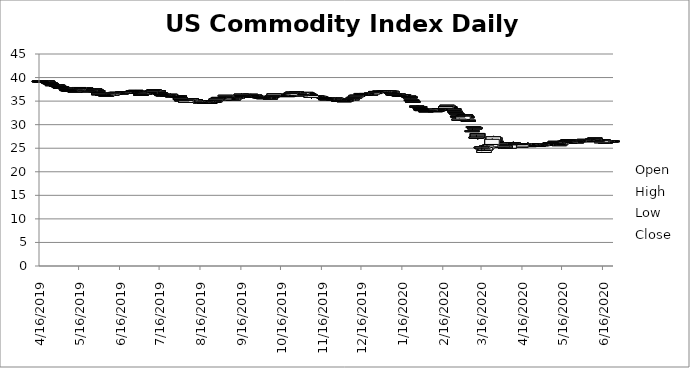
| Category | Open | High | Low | Close |
|---|---|---|---|---|
| 6/23/20 | 26.52 | 26.63 | 26.373 | 26.57 |
| 6/22/20 | 26.58 | 26.58 | 26.45 | 26.52 |
| 6/19/20 | 26.35 | 26.66 | 26.35 | 26.47 |
| 6/18/20 | 26.33 | 26.44 | 26.28 | 26.31 |
| 6/17/20 | 26.38 | 26.57 | 26.38 | 26.57 |
| 6/16/20 | 26.82 | 26.82 | 26.36 | 26.5 |
| 6/15/20 | 26.17 | 26.62 | 26.02 | 26.58 |
| 6/12/20 | 26.69 | 26.75 | 26.47 | 26.58 |
| 6/11/20 | 26.7 | 26.88 | 26.49 | 26.49 |
| 6/10/20 | 27.11 | 27.18 | 26.895 | 27.18 |
| 6/9/20 | 26.71 | 26.93 | 26.71 | 26.898 |
| 6/8/20 | 26.8 | 26.93 | 26.77 | 26.92 |
| 6/5/20 | 26.8 | 26.8 | 26.71 | 26.71 |
| 6/4/20 | 26.55 | 26.819 | 26.55 | 26.75 |
| 6/3/20 | 26.6 | 26.83 | 26.49 | 26.55 |
| 6/2/20 | 26.88 | 26.887 | 26.68 | 26.68 |
| 6/1/20 | 26.63 | 26.86 | 26.515 | 26.77 |
| 5/29/20 | 26.41 | 26.665 | 26.4 | 26.64 |
| 5/28/20 | 26.65 | 26.65 | 26.326 | 26.42 |
| 5/27/20 | 26.27 | 26.5 | 26.27 | 26.35 |
| 5/26/20 | 26.53 | 26.55 | 26.492 | 26.55 |
| 5/22/20 | 26.11 | 26.37 | 26.11 | 26.34 |
| 5/21/20 | 26.78 | 26.86 | 26.336 | 26.336 |
| 5/20/20 | 26.69 | 26.84 | 26.68 | 26.68 |
| 5/19/20 | 26.44 | 26.71 | 26.44 | 26.5 |
| 5/18/20 | 26.43 | 26.67 | 26.31 | 26.46 |
| 5/15/20 | 25.76 | 26.178 | 25.76 | 26.1 |
| 5/14/20 | 25.55 | 25.907 | 25.55 | 25.82 |
| 5/13/20 | 26.29 | 26.29 | 25.78 | 25.79 |
| 5/12/20 | 26.09 | 26.27 | 25.94 | 26.14 |
| 5/11/20 | 26.46 | 26.46 | 26 | 26.06 |
| 5/8/20 | 26.21 | 26.4 | 26.145 | 26.21 |
| 5/7/20 | 26.12 | 26.2 | 25.975 | 26.06 |
| 5/6/20 | 25.86 | 25.89 | 25.72 | 25.89 |
| 5/5/20 | 25.81 | 25.95 | 25.758 | 25.77 |
| 5/4/20 | 25.61 | 25.87 | 25.61 | 25.79 |
| 5/1/20 | 25.55 | 25.9 | 25.55 | 25.81 |
| 4/30/20 | 25.66 | 25.81 | 25.56 | 25.77 |
| 4/29/20 | 25.84 | 25.87 | 25.555 | 25.6 |
| 4/28/20 | 25.58 | 25.816 | 25.515 | 25.64 |
| 4/27/20 | 25.58 | 25.62 | 25.45 | 25.5 |
| 4/24/20 | 25.98 | 25.98 | 25.45 | 25.54 |
| 4/23/20 | 26 | 26 | 25.72 | 25.92 |
| 4/22/20 | 25.66 | 25.91 | 25.66 | 25.85 |
| 4/21/20 | 25.56 | 25.7 | 25.35 | 25.51 |
| 4/20/20 | 26 | 26.25 | 25.95 | 25.99 |
| 4/17/20 | 25.77 | 26.079 | 25.77 | 25.99 |
| 4/16/20 | 25.89 | 26 | 25.78 | 25.98 |
| 4/15/20 | 25.27 | 25.89 | 25.27 | 25.77 |
| 4/14/20 | 25.97 | 26.23 | 25.782 | 25.95 |
| 4/13/20 | 25.98 | 26.1 | 25.739 | 25.92 |
| 4/9/20 | 26.05 | 26.4 | 25.99 | 26.12 |
| 4/8/20 | 26 | 26.268 | 26 | 26.1 |
| 4/7/20 | 25.9 | 26.05 | 25.755 | 25.88 |
| 4/6/20 | 25 | 25.7 | 25 | 25.7 |
| 4/3/20 | 25.58 | 25.58 | 25 | 25.06 |
| 4/2/20 | 25.69 | 25.69 | 25.14 | 25.57 |
| 4/1/20 | 25.28 | 25.87 | 25.28 | 25.53 |
| 3/31/20 | 25.97 | 26.07 | 25.72 | 25.9 |
| 3/30/20 | 25.87 | 26.08 | 25.73 | 26.08 |
| 3/27/20 | 26.5 | 26.5 | 26.151 | 26.352 |
| 3/26/20 | 27.23 | 27.25 | 26.501 | 26.79 |
| 3/25/20 | 26.7 | 27.62 | 26.7 | 27.43 |
| 3/24/20 | 25.8 | 27.13 | 25.8 | 26.895 |
| 3/23/20 | 25.29 | 25.84 | 25.29 | 25.79 |
| 3/20/20 | 24.84 | 25.868 | 24.84 | 25.5 |
| 3/19/20 | 24.61 | 25.344 | 24.559 | 25.15 |
| 3/18/20 | 24.1 | 25.154 | 24.03 | 24.52 |
| 3/17/20 | 24.87 | 25.795 | 24.87 | 25.314 |
| 3/16/20 | 25.12 | 25.64 | 24.37 | 25.24 |
| 3/13/20 | 28.13 | 28.13 | 26.865 | 27.23 |
| 3/12/20 | 27.19 | 27.846 | 27.19 | 27.36 |
| 3/11/20 | 29.39 | 29.465 | 29.055 | 29.095 |
| 3/10/20 | 29.42 | 29.66 | 29.293 | 29.59 |
| 3/9/20 | 28.56 | 29.202 | 28.49 | 28.73 |
| 3/6/20 | 30.95 | 31.2 | 30.62 | 30.72 |
| 3/5/20 | 31.67 | 31.72 | 31.429 | 31.47 |
| 3/4/20 | 32.06 | 32.067 | 31.82 | 31.866 |
| 3/3/20 | 31.92 | 32.323 | 31.84 | 32.01 |
| 3/2/20 | 31.11 | 31.84 | 31.11 | 31.8 |
| 2/28/20 | 31 | 31.31 | 30.91 | 31.18 |
| 2/27/20 | 31.83 | 31.98 | 31.64 | 31.79 |
| 2/26/20 | 32.47 | 32.6 | 32.31 | 32.31 |
| 2/25/20 | 32.87 | 33.09 | 32.63 | 32.639 |
| 2/24/20 | 33.37 | 33.57 | 33.061 | 33.09 |
| 2/21/20 | 33.78 | 33.87 | 33.712 | 33.75 |
| 2/20/20 | 33.94 | 34.08 | 33.87 | 33.93 |
| 2/19/20 | 33.9 | 34.133 | 33.86 | 34.115 |
| 2/18/20 | 33.5 | 33.86 | 33.5 | 33.85 |
| 2/14/20 | 33.28 | 33.4 | 33.28 | 33.31 |
| 2/13/20 | 33.28 | 33.35 | 33.28 | 33.33 |
| 2/12/20 | 33.14 | 33.2 | 33.06 | 33.17 |
| 2/11/20 | 33.08 | 33.085 | 32.96 | 32.98 |
| 2/10/20 | 32.97 | 33.01 | 32.895 | 32.91 |
| 2/7/20 | 33.18 | 33.25 | 33.17 | 33.19 |
| 2/6/20 | 32.96 | 33.3 | 32.96 | 33.3 |
| 2/5/20 | 33.06 | 33.16 | 33.04 | 33.07 |
| 2/4/20 | 33.07 | 33.12 | 32.89 | 32.92 |
| 2/3/20 | 32.93 | 33.017 | 32.76 | 32.9 |
| 1/31/20 | 33.2 | 33.3 | 33.061 | 33.08 |
| 1/30/20 | 33.37 | 33.424 | 33.2 | 33.375 |
| 1/29/20 | 33.84 | 33.84 | 33.549 | 33.583 |
| 1/28/20 | 33.83 | 34.02 | 33.79 | 33.86 |
| 1/27/20 | 33.95 | 34.05 | 33.76 | 33.82 |
| 1/24/20 | 34.98 | 34.98 | 34.68 | 34.75 |
| 1/23/20 | 35.23 | 35.34 | 35.1 | 35.305 |
| 1/22/20 | 35.88 | 35.88 | 35.63 | 35.67 |
| 1/21/20 | 36.06 | 36.07 | 35.94 | 35.95 |
| 1/17/20 | 36.22 | 36.34 | 36.15 | 36.34 |
| 1/16/20 | 36.29 | 36.326 | 36.05 | 36.11 |
| 1/15/20 | 36.4 | 36.4 | 36.195 | 36.34 |
| 1/14/20 | 36.12 | 36.28 | 36.1 | 36.28 |
| 1/13/20 | 36.5 | 36.5 | 36.15 | 36.17 |
| 1/10/20 | 36.43 | 36.58 | 36.37 | 36.45 |
| 1/9/20 | 36.54 | 36.54 | 36.321 | 36.37 |
| 1/8/20 | 37.07 | 37.07 | 36.43 | 36.65 |
| 1/7/20 | 36.83 | 37.097 | 36.83 | 37.064 |
| 1/6/20 | 37.12 | 37.12 | 36.86 | 36.88 |
| 1/3/20 | 36.96 | 37.27 | 36.96 | 37.07 |
| 1/2/20 | 36.9 | 37.15 | 36.9 | 37.1 |
| 12/31/19 | 37.02 | 37.04 | 36.83 | 36.9 |
| 12/30/19 | 36.97 | 37.25 | 36.97 | 37.12 |
| 12/27/19 | 37.05 | 37.092 | 37.03 | 37.05 |
| 12/26/19 | 36.7 | 36.95 | 36.7 | 36.82 |
| 12/24/19 | 36.43 | 36.781 | 36.43 | 36.781 |
| 12/23/19 | 36.28 | 36.516 | 36.28 | 36.49 |
| 12/20/19 | 36.62 | 36.641 | 36.5 | 36.517 |
| 12/19/19 | 36.45 | 36.531 | 36.45 | 36.49 |
| 12/18/19 | 36.38 | 36.54 | 36 | 36.45 |
| 12/17/19 | 36.54 | 36.54 | 36.46 | 36.47 |
| 12/16/19 | 36.43 | 36.65 | 36.411 | 36.62 |
| 12/13/19 | 36.23 | 36.59 | 36.111 | 36.16 |
| 12/12/19 | 35.92 | 36.23 | 35.57 | 36.22 |
| 12/11/19 | 35.73 | 35.94 | 35.64 | 35.86 |
| 12/10/19 | 35.55 | 35.82 | 35.55 | 35.78 |
| 12/9/19 | 35.32 | 35.585 | 35.32 | 35.48 |
| 12/6/19 | 35.3 | 35.52 | 35.3 | 35.46 |
| 12/5/19 | 35.09 | 35.378 | 35.09 | 35.3 |
| 12/4/19 | 35.27 | 35.356 | 35.19 | 35.19 |
| 12/3/19 | 34.95 | 35.185 | 34.942 | 35.08 |
| 12/2/19 | 35.13 | 35.13 | 34.93 | 34.98 |
| 11/29/19 | 35.17 | 35.2 | 35.02 | 35.02 |
| 11/27/19 | 35.58 | 35.62 | 35.41 | 35.47 |
| 11/26/19 | 35.53 | 35.71 | 35.53 | 35.71 |
| 11/25/19 | 35.35 | 35.51 | 35.35 | 35.46 |
| 11/22/19 | 35.63 | 35.71 | 35.441 | 35.51 |
| 11/21/19 | 35.61 | 35.76 | 35.61 | 35.7 |
| 11/20/19 | 35.3 | 35.64 | 35.3 | 35.5 |
| 11/19/19 | 35.51 | 35.539 | 35.424 | 35.494 |
| 11/18/19 | 35.76 | 35.774 | 35.581 | 35.615 |
| 11/15/19 | 35.86 | 36.061 | 35.85 | 35.975 |
| 11/14/19 | 36 | 36 | 35.7 | 35.97 |
| 11/13/19 | 35.91 | 36.052 | 35.91 | 36.01 |
| 11/12/19 | 36.01 | 36.121 | 35.99 | 36.06 |
| 11/11/19 | 35.92 | 36.08 | 35.92 | 35.99 |
| 11/8/19 | 35.79 | 36.225 | 35.497 | 36.19 |
| 11/7/19 | 36.4 | 36.418 | 36.212 | 36.23 |
| 11/6/19 | 36.55 | 36.62 | 36.286 | 36.34 |
| 11/5/19 | 36.68 | 36.765 | 36.615 | 36.702 |
| 11/4/19 | 36.85 | 36.933 | 36.72 | 36.78 |
| 11/1/19 | 36.4 | 36.84 | 36.4 | 36.77 |
| 10/31/19 | 36.21 | 36.338 | 36.09 | 36.32 |
| 10/30/19 | 36.6 | 36.67 | 36.38 | 36.42 |
| 10/29/19 | 36.54 | 36.8 | 36.54 | 36.72 |
| 10/28/19 | 36.92 | 36.92 | 36.707 | 36.758 |
| 10/25/19 | 36.79 | 36.91 | 36.71 | 36.91 |
| 10/24/19 | 36.74 | 36.835 | 36.705 | 36.77 |
| 10/23/19 | 36.22 | 36.59 | 36.166 | 36.59 |
| 10/22/19 | 36.07 | 36.272 | 36.07 | 36.196 |
| 10/21/19 | 36.09 | 36.17 | 36.037 | 36.17 |
| 10/18/19 | 36.28 | 36.335 | 36.11 | 36.21 |
| 10/17/19 | 36.21 | 36.23 | 36.06 | 36.222 |
| 10/16/19 | 36.11 | 36.29 | 36.11 | 36.218 |
| 10/15/19 | 36.2 | 36.39 | 36.2 | 36.285 |
| 10/14/19 | 36.39 | 36.39 | 36.125 | 36.35 |
| 10/11/19 | 36.3 | 36.582 | 36.3 | 36.57 |
| 10/10/19 | 36.07 | 36.167 | 35.915 | 36.16 |
| 10/9/19 | 36.03 | 36.03 | 35.68 | 35.82 |
| 10/8/19 | 35.44 | 35.739 | 35.44 | 35.66 |
| 10/7/19 | 35.79 | 35.807 | 35.55 | 35.578 |
| 10/4/19 | 35.8 | 35.896 | 35.69 | 35.83 |
| 10/3/19 | 35.54 | 35.81 | 35.485 | 35.73 |
| 10/2/19 | 35.86 | 35.9 | 35.6 | 35.727 |
| 10/1/19 | 35.91 | 35.97 | 35.765 | 35.87 |
| 9/30/19 | 35.92 | 36.16 | 35.78 | 35.834 |
| 9/27/19 | 36.02 | 36.275 | 36.02 | 36.14 |
| 9/26/19 | 36.27 | 36.347 | 36.178 | 36.315 |
| 9/25/19 | 36.14 | 36.36 | 36.14 | 36.31 |
| 9/24/19 | 36.33 | 36.43 | 36.31 | 36.38 |
| 9/23/19 | 36.39 | 36.53 | 36.39 | 36.45 |
| 9/20/19 | 36.21 | 36.35 | 36.12 | 36.19 |
| 9/19/19 | 36.15 | 36.25 | 36.14 | 36.15 |
| 9/18/19 | 35.94 | 36.1 | 35.94 | 35.99 |
| 9/17/19 | 36.23 | 36.31 | 35.99 | 36.04 |
| 9/16/19 | 36.36 | 36.58 | 36.36 | 36.47 |
| 9/13/19 | 35.86 | 35.98 | 35.75 | 35.77 |
| 9/12/19 | 35.55 | 35.792 | 35.55 | 35.76 |
| 9/11/19 | 35.72 | 35.792 | 35.508 | 35.62 |
| 9/10/19 | 35.25 | 35.83 | 35.25 | 35.69 |
| 9/9/19 | 35.6 | 35.763 | 35.57 | 35.57 |
| 9/6/19 | 35.59 | 35.69 | 35.5 | 35.51 |
| 9/5/19 | 36.12 | 36.12 | 35.73 | 35.73 |
| 9/4/19 | 36 | 36.239 | 35.98 | 36.23 |
| 9/3/19 | 35.26 | 35.66 | 35.26 | 35.63 |
| 8/30/19 | 35.78 | 35.85 | 35.5 | 35.51 |
| 8/29/19 | 35.59 | 35.74 | 35.49 | 35.544 |
| 8/28/19 | 35.28 | 35.568 | 35.244 | 35.48 |
| 8/27/19 | 34.94 | 35.134 | 34.94 | 35.07 |
| 8/26/19 | 34.96 | 35.051 | 34.96 | 35.01 |
| 8/23/19 | 34.72 | 34.85 | 34.6 | 34.69 |
| 8/22/19 | 34.74 | 35.024 | 34.74 | 34.86 |
| 8/21/19 | 35.04 | 35.11 | 34.93 | 34.93 |
| 8/20/19 | 34.83 | 34.967 | 34.83 | 34.96 |
| 8/19/19 | 34.71 | 34.866 | 34.71 | 34.82 |
| 8/16/19 | 34.76 | 35.01 | 34.76 | 34.83 |
| 8/15/19 | 34.95 | 35.12 | 34.91 | 34.92 |
| 8/14/19 | 34.9 | 35.09 | 34.9 | 34.97 |
| 8/13/19 | 34.8 | 35.32 | 34.734 | 35.05 |
| 8/12/19 | 35.33 | 35.365 | 34.586 | 35 |
| 8/9/19 | 35.51 | 35.554 | 35.42 | 35.42 |
| 8/8/19 | 35.07 | 35.46 | 35.07 | 35.41 |
| 8/7/19 | 34.9 | 35.123 | 34.72 | 35.108 |
| 8/6/19 | 35.24 | 35.26 | 34.946 | 35 |
| 8/5/19 | 34.73 | 35.24 | 34.73 | 35.15 |
| 8/2/19 | 35.25 | 35.29 | 35.1 | 35.1 |
| 8/1/19 | 35.66 | 35.66 | 35.23 | 35.32 |
| 7/31/19 | 36.12 | 36.18 | 35.83 | 35.84 |
| 7/30/19 | 36.13 | 36.13 | 36.01 | 36.05 |
| 7/29/19 | 36.16 | 36.21 | 36.11 | 36.14 |
| 7/26/19 | 36.08 | 36.22 | 36.08 | 36.1 |
| 7/25/19 | 36.22 | 36.474 | 36.22 | 36.23 |
| 7/24/19 | 36.45 | 36.6 | 36.242 | 36.36 |
| 7/23/19 | 36.15 | 36.4 | 36.11 | 36.35 |
| 7/22/19 | 36.32 | 36.422 | 36.23 | 36.25 |
| 7/19/19 | 36.23 | 36.364 | 36.229 | 36.32 |
| 7/18/19 | 36.381 | 36.4 | 36.049 | 36.195 |
| 7/17/19 | 36.71 | 36.71 | 36.39 | 36.4 |
| 7/16/19 | 36.8 | 36.82 | 36.555 | 36.62 |
| 7/15/19 | 37.2 | 37.2 | 36.92 | 36.92 |
| 7/12/19 | 37.24 | 37.5 | 37.24 | 37.45 |
| 7/11/19 | 37.08 | 37.284 | 37.072 | 37.22 |
| 7/10/19 | 37.01 | 37.18 | 36.98 | 37.13 |
| 7/9/19 | 36.6 | 36.84 | 36.57 | 36.81 |
| 7/8/19 | 36.83 | 36.894 | 36.77 | 36.8 |
| 7/5/19 | 36.72 | 36.812 | 36.65 | 36.69 |
| 7/3/19 | 36.44 | 36.7 | 36.44 | 36.7 |
| 7/2/19 | 36.43 | 36.5 | 36.18 | 36.22 |
| 7/1/19 | 37 | 37.051 | 36.64 | 36.695 |
| 6/28/19 | 37.28 | 37.36 | 36.92 | 36.97 |
| 6/27/19 | 37.25 | 37.292 | 37.15 | 37.22 |
| 6/26/19 | 37.08 | 37.286 | 37.06 | 37.15 |
| 6/25/19 | 37.01 | 37.21 | 37 | 37.01 |
| 6/24/19 | 36.88 | 36.97 | 36.8 | 36.83 |
| 6/21/19 | 36.93 | 37 | 36.78 | 36.78 |
| 6/20/19 | 37 | 37.14 | 36.97 | 36.97 |
| 6/19/19 | 36.77 | 36.926 | 36.761 | 36.88 |
| 6/18/19 | 36.71 | 37.069 | 36.71 | 36.93 |
| 6/17/19 | 36.68 | 36.82 | 36.67 | 36.73 |
| 6/14/19 | 36.85 | 36.92 | 36.71 | 36.71 |
| 6/13/19 | 36.85 | 36.88 | 36.725 | 36.77 |
| 6/12/19 | 36.64 | 36.83 | 36.62 | 36.62 |
| 6/11/19 | 36.58 | 36.82 | 36.58 | 36.74 |
| 6/10/19 | 36.28 | 36.62 | 36.28 | 36.54 |
| 6/7/19 | 36.42 | 36.55 | 36.33 | 36.33 |
| 6/6/19 | 36.06 | 36.56 | 36.06 | 36.55 |
| 6/5/19 | 36.35 | 36.422 | 36.13 | 36.17 |
| 6/4/19 | 36.28 | 36.47 | 36.28 | 36.41 |
| 6/3/19 | 36.43 | 36.51 | 36.3 | 36.3 |
| 5/31/19 | 36.71 | 36.84 | 36.331 | 36.35 |
| 5/30/19 | 37.25 | 37.31 | 36.96 | 36.97 |
| 5/29/19 | 37.38 | 37.38 | 37.07 | 37.21 |
| 5/28/19 | 37.58 | 37.62 | 37.35 | 37.37 |
| 5/24/19 | 37.11 | 37.3 | 36.89 | 37.3 |
| 5/23/19 | 37.17 | 37.2 | 36.92 | 36.98 |
| 5/22/19 | 37.63 | 37.64 | 37.37 | 37.37 |
| 5/21/19 | 37.8 | 37.93 | 37.77 | 37.78 |
| 5/20/19 | 37.8 | 37.91 | 37.8 | 37.825 |
| 5/17/19 | 37.73 | 37.867 | 37.653 | 37.66 |
| 5/16/19 | 37.73 | 37.94 | 37.72 | 37.89 |
| 5/15/19 | 37.33 | 37.702 | 37.33 | 37.58 |
| 5/14/19 | 37.21 | 37.47 | 37.21 | 37.37 |
| 5/13/19 | 37.3 | 37.45 | 36.93 | 36.93 |
| 5/10/19 | 37.29 | 37.45 | 37.29 | 37.38 |
| 5/9/19 | 37.25 | 37.34 | 37.1 | 37.298 |
| 5/8/19 | 37.38 | 37.566 | 37.32 | 37.32 |
| 5/7/19 | 37.44 | 37.6 | 37.34 | 37.42 |
| 5/6/19 | 37.73 | 37.85 | 37.684 | 37.8 |
| 5/3/19 | 38 | 38.13 | 37.87 | 37.89 |
| 5/2/19 | 37.96 | 38.08 | 37.841 | 37.91 |
| 5/1/19 | 38.14 | 38.2 | 38.05 | 38.09 |
| 4/30/19 | 38.39 | 38.43 | 38.23 | 38.25 |
| 4/29/19 | 38.39 | 38.411 | 38.11 | 38.258 |
| 4/26/19 | 38.49 | 38.49 | 38.34 | 38.35 |
| 4/25/19 | 38.74 | 38.74 | 38.51 | 38.52 |
| 4/24/19 | 38.91 | 38.91 | 38.72 | 38.75 |
| 4/23/19 | 39.03 | 39.03 | 38.91 | 38.94 |
| 4/22/19 | 39.28 | 39.28 | 39.07 | 39.08 |
| 4/18/19 | 39.1 | 39.208 | 39.04 | 39.16 |
| 4/17/19 | 39.33 | 39.4 | 39.15 | 39.178 |
| 4/16/19 | 39.28 | 39.33 | 39.21 | 39.27 |